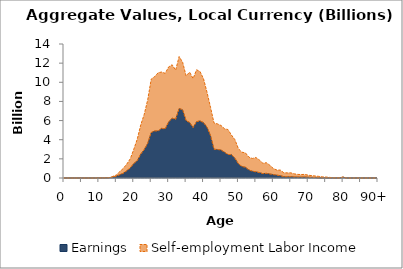
| Category | Earnings | Self-employment Labor Income |
|---|---|---|
| 0 | 0 | 0 |
|  | 0 | 0 |
| 2 | 0 | 0 |
| 3 | 0 | 0 |
| 4 | 0 | 0 |
| 5 | 0 | 0 |
| 6 | 0 | 0 |
| 7 | 0 | 0 |
| 8 | 0 | 0 |
| 9 | 0 | 0 |
| 10 | 6.032 | 0.553 |
| 11 | 8.63 | 0.988 |
| 12 | 14.604 | 4.424 |
| 13 | 29.753 | 6.344 |
| 14 | 98.997 | 67.141 |
| 15 | 195.217 | 122.159 |
| 16 | 344.186 | 331.745 |
| 17 | 496.062 | 505.735 |
| 18 | 757.898 | 698.704 |
| 19 | 1054.191 | 957.904 |
| 20 | 1512.553 | 1484.69 |
| 21 | 1802.687 | 2258.256 |
| 22 | 2498.848 | 3052.526 |
| 23 | 2973.346 | 3684.912 |
| 24 | 3625.262 | 4559.87 |
| 25 | 4752.929 | 5577.919 |
| 26 | 4915.021 | 5682.928 |
| 27 | 4914.473 | 6087.822 |
| 28 | 5190.6 | 5878.157 |
| 29 | 5126.723 | 5810.272 |
| 30 | 5851.375 | 5754.768 |
| 31 | 6254.068 | 5574.887 |
| 32 | 6129.336 | 5139.839 |
| 33 | 7265.105 | 5422.402 |
| 34 | 7125.282 | 4967.737 |
| 35 | 5981.143 | 4690.186 |
| 36 | 5805.04 | 5255.662 |
| 37 | 5262.033 | 5126.32 |
| 38 | 5889.465 | 5418.583 |
| 39 | 5963.289 | 5152.484 |
| 40 | 5783.968 | 4572.274 |
| 41 | 5303.512 | 3644.307 |
| 42 | 4424.511 | 2957.416 |
| 43 | 2997.755 | 2742.644 |
| 44 | 2978.958 | 2672.862 |
| 45 | 2923.346 | 2565.707 |
| 46 | 2696.15 | 2453.613 |
| 47 | 2451.955 | 2608.915 |
| 48 | 2457.483 | 2028.399 |
| 49 | 2049.889 | 1948.191 |
| 50 | 1477.32 | 1579.229 |
| 51 | 1199.28 | 1498.65 |
| 52 | 1120.661 | 1504.904 |
| 53 | 844.547 | 1331.216 |
| 54 | 705.753 | 1335.522 |
| 55 | 641.544 | 1497.938 |
| 56 | 564.885 | 1316.226 |
| 57 | 457.247 | 1080.729 |
| 58 | 485.78 | 1111.849 |
| 59 | 420.372 | 909.168 |
| 60 | 356.098 | 637.563 |
| 61 | 295.992 | 535.496 |
| 62 | 243.256 | 584.092 |
| 63 | 137.855 | 410.398 |
| 64 | 133.186 | 400.563 |
| 65 | 145.749 | 393.156 |
| 66 | 111.498 | 322.097 |
| 67 | 105.557 | 270.65 |
| 68 | 97.918 | 259.988 |
| 69 | 109.793 | 268.568 |
| 70 | 81.369 | 211.685 |
| 71 | 66.436 | 179.607 |
| 72 | 45.995 | 163.132 |
| 73 | 21.122 | 150.778 |
| 74 | 15.924 | 102.615 |
| 75 | 13.265 | 90.567 |
| 76 | 9.077 | 59.188 |
| 77 | 4.538 | 28.403 |
| 78 | 1.014 | 10.588 |
| 79 | 1.592 | 16.63 |
| 80 | 85.345 | 18.204 |
| 81 | 0 | 0 |
| 82 | 0 | 0 |
| 83 | 0 | 0 |
| 84 | 0 | 0 |
| 85 | 0 | 0 |
| 86 | 0 | 0 |
| 87 | 0 | 0 |
| 88 | 0 | 0 |
| 89 | 0 | 0 |
| 90+ | 0 | 0 |